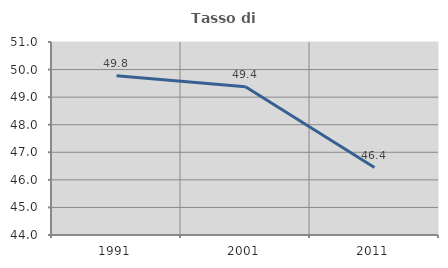
| Category | Tasso di occupazione   |
|---|---|
| 1991.0 | 49.773 |
| 2001.0 | 49.376 |
| 2011.0 | 46.447 |